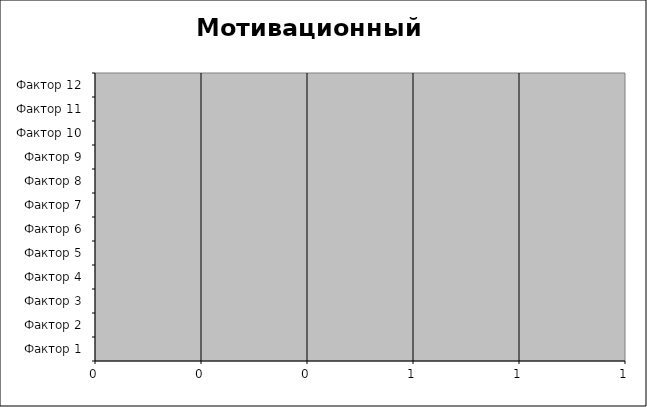
| Category | Series 0 |
|---|---|
| Фактор 1 | 0 |
| Фактор 2 | 0 |
| Фактор 3 | 0 |
| Фактор 4 | 0 |
| Фактор 5 | 0 |
| Фактор 6 | 0 |
| Фактор 7 | 0 |
| Фактор 8 | 0 |
| Фактор 9 | 0 |
| Фактор 10 | 0 |
| Фактор 11 | 0 |
| Фактор 12 | 0 |